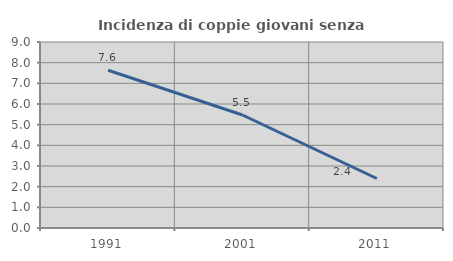
| Category | Incidenza di coppie giovani senza figli |
|---|---|
| 1991.0 | 7.634 |
| 2001.0 | 5.467 |
| 2011.0 | 2.396 |